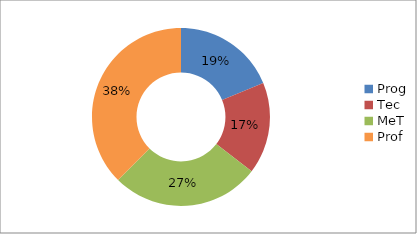
| Category | Series 0 |
|---|---|
| Prog | 9 |
| Tec | 8 |
| MeT | 13 |
| Prof | 18 |